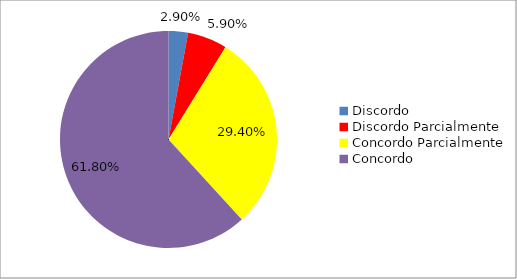
| Category | Series 0 |
|---|---|
| Discordo  | 0.029 |
| Discordo Parcialmente | 0.059 |
| Concordo Parcialmente | 0.294 |
| Concordo | 0.618 |